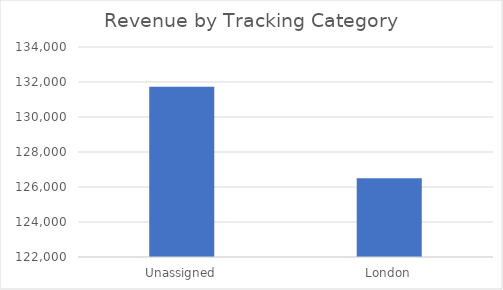
| Category | Total |
|---|---|
| Unassigned | 131723.9 |
| London | 126502.53 |